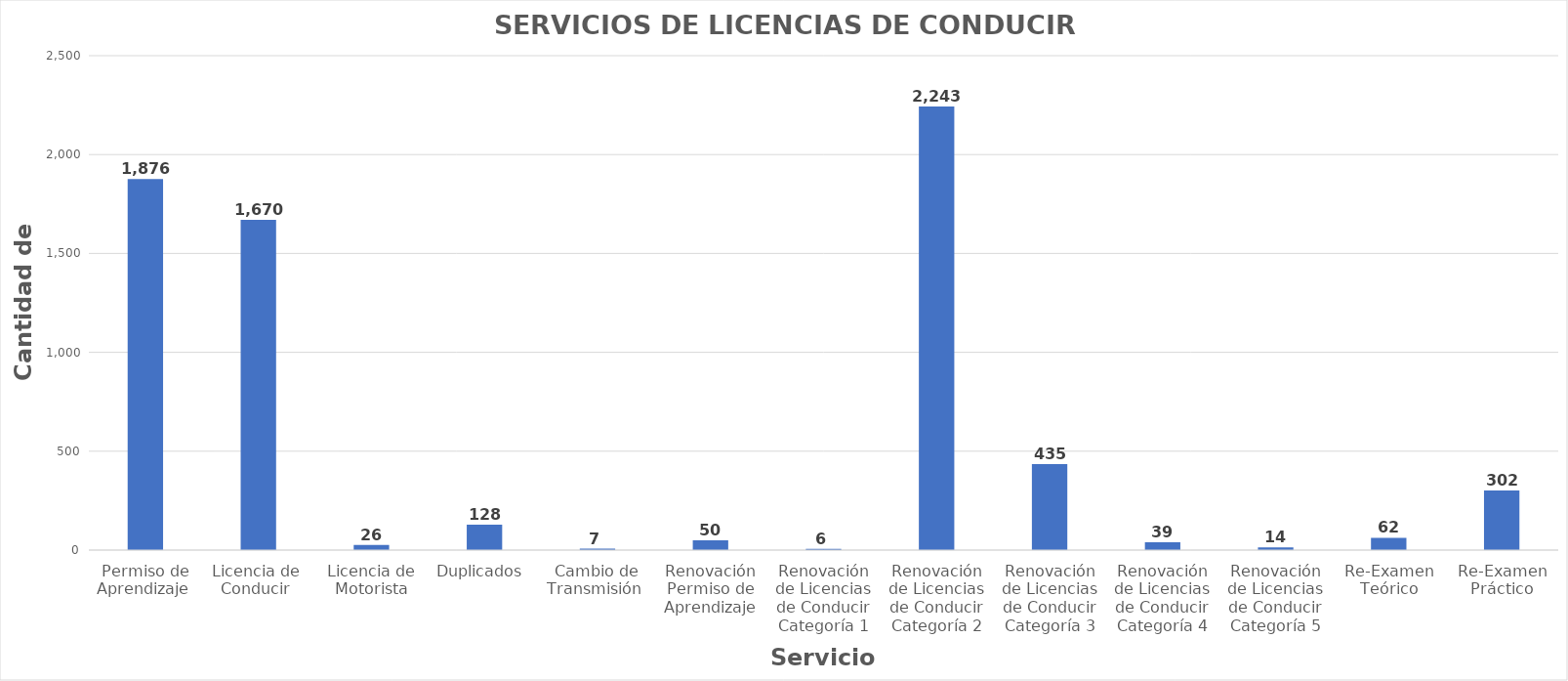
| Category | Series 0 |
|---|---|
| Permiso de Aprendizaje  | 1876 |
| Licencia de  Conducir  | 1670 |
| Licencia de Motorista | 26 |
| Duplicados  | 128 |
| Cambio de Transmisión  | 7 |
| Renovación Permiso de Aprendizaje | 50 |
| Renovación de Licencias de Conducir Categoría 1 | 6 |
| Renovación de Licencias de Conducir Categoría 2 | 2243 |
| Renovación de Licencias de Conducir Categoría 3 | 435 |
| Renovación de Licencias de Conducir Categoría 4 | 39 |
| Renovación de Licencias de Conducir Categoría 5 | 14 |
| Re-Examen Teórico | 62 |
| Re-Examen Práctico | 302 |